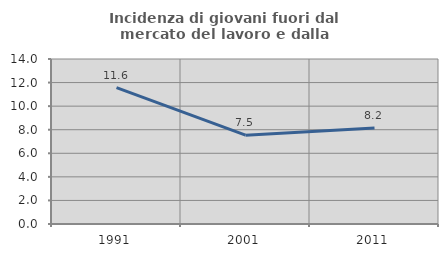
| Category | Incidenza di giovani fuori dal mercato del lavoro e dalla formazione  |
|---|---|
| 1991.0 | 11.57 |
| 2001.0 | 7.536 |
| 2011.0 | 8.155 |